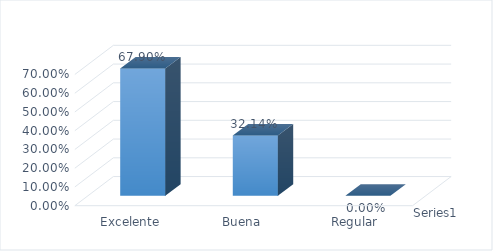
| Category | Series 0 |
|---|---|
| Excelente | 0.679 |
| Buena | 0.321 |
| Regular | 0 |